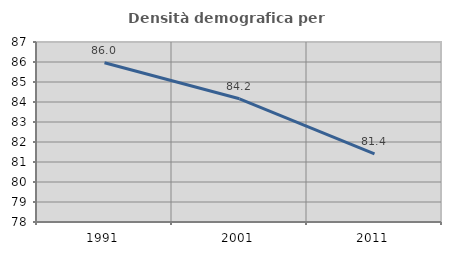
| Category | Densità demografica |
|---|---|
| 1991.0 | 85.966 |
| 2001.0 | 84.16 |
| 2011.0 | 81.409 |